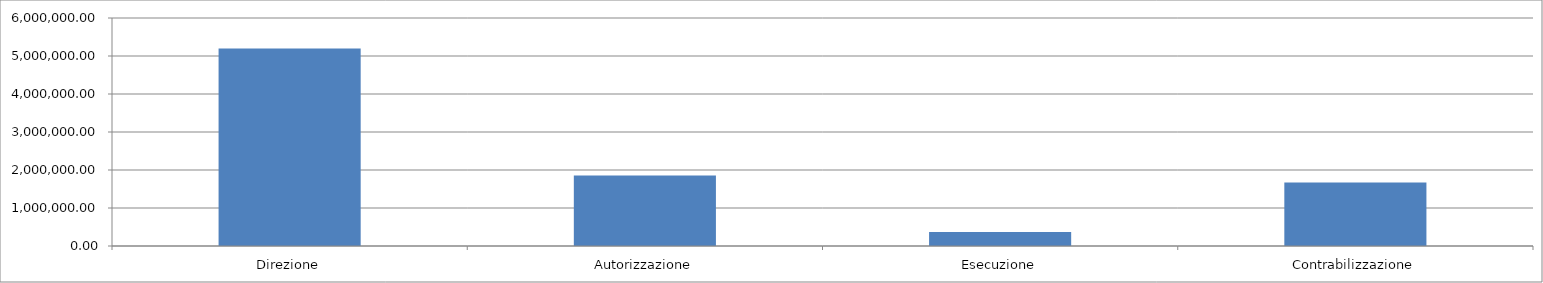
| Category | Series 0 |
|---|---|
| Direzione | 5199333.263 |
| Autorizzazione | 1856904.737 |
| Esecuzione | 371380.947 |
| Contrabilizzazione | 1671214.263 |